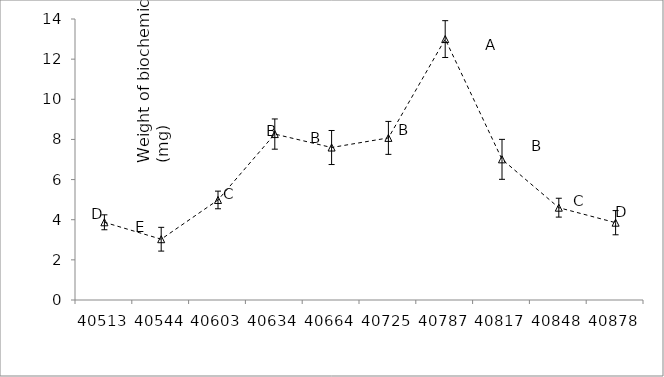
| Category | Series 0 |
|---|---|
| 40513.0 | 3.872 |
| 40544.0 | 3.029 |
| 40603.0 | 4.984 |
| 40634.0 | 8.267 |
| 40664.0 | 7.597 |
| 40725.0 | 8.077 |
| 40787.0 | 13 |
| 40817.0 | 7.008 |
| 40848.0 | 4.6 |
| 40878.0 | 3.852 |